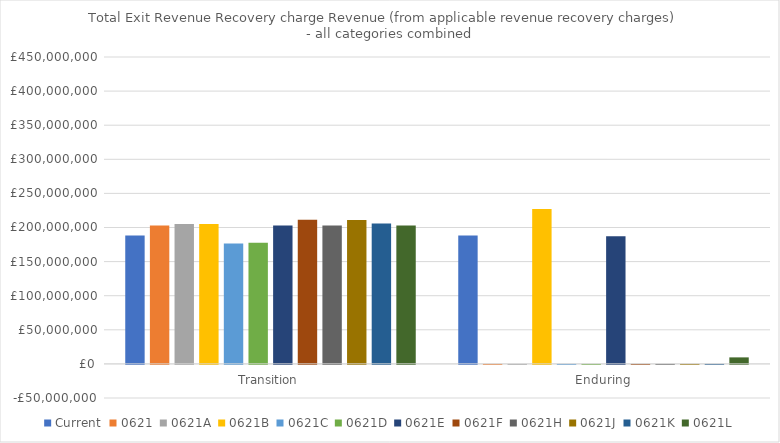
| Category | Current | 0621 | 0621A | 0621B | 0621C | 0621D | 0621E | 0621F | 0621H | 0621J | 0621K | 0621L |
|---|---|---|---|---|---|---|---|---|---|---|---|---|
| Transition | 188401075.293 | 203095063.755 | 205308710.926 | 205308710.926 | 176441267.136 | 177696346.972 | 203095063.755 | 211307847.669 | 203095063.755 | 210833465.935 | 205751711.852 | 203095063.755 |
| Enduring | 188401075.293 | 0 | 0 | 227065062.959 | 0 | 0 | 187004776.126 | 0 | 0 | 0 | 0 | 9556000.717 |